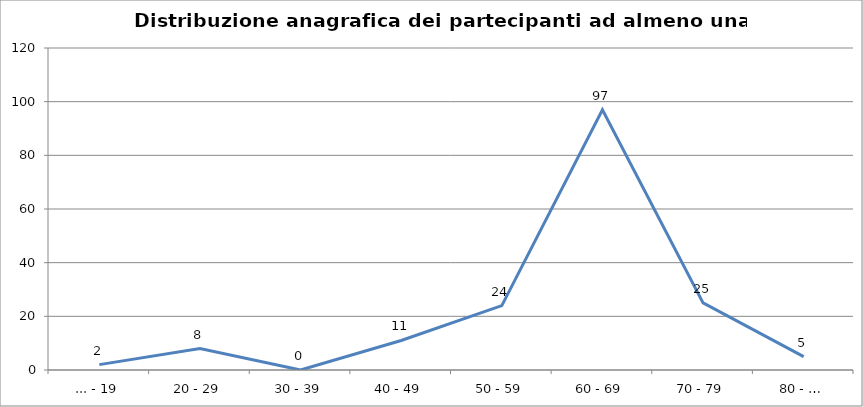
| Category | Nr. Tesserati |
|---|---|
| ... - 19 | 2 |
| 20 - 29 | 8 |
| 30 - 39 | 0 |
| 40 - 49 | 11 |
| 50 - 59 | 24 |
| 60 - 69 | 97 |
| 70 - 79 | 25 |
| 80 - … | 5 |